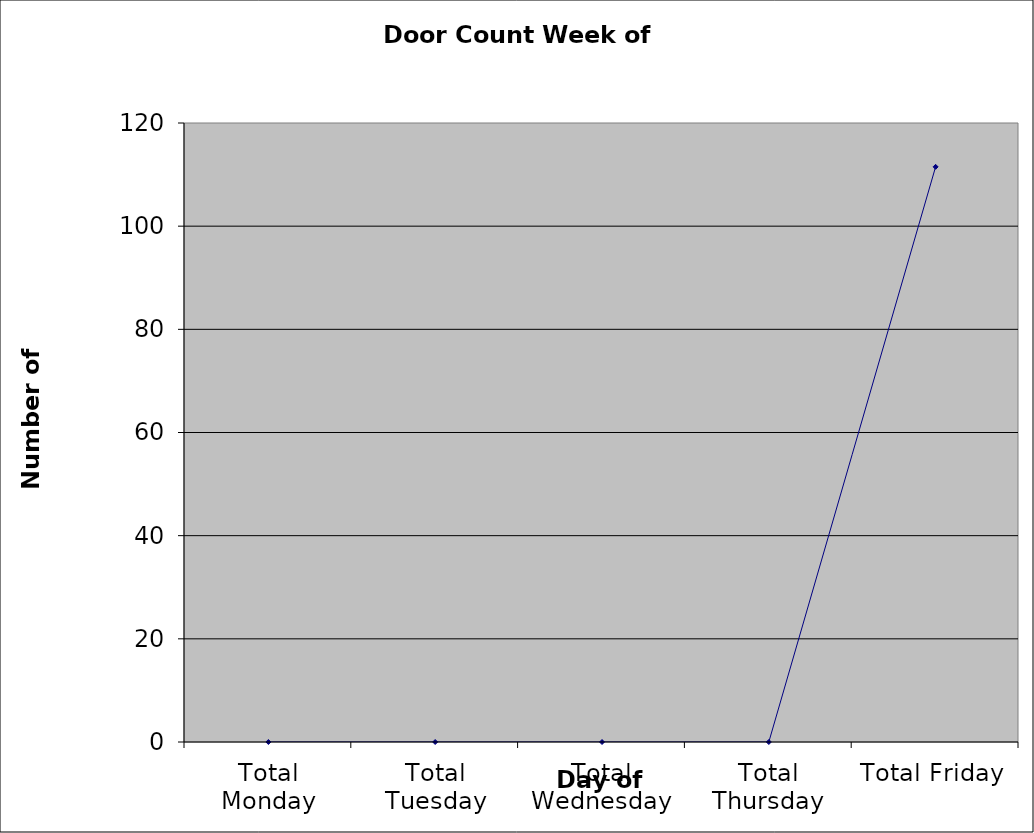
| Category | Series 0 |
|---|---|
| Total Monday | 0 |
| Total Tuesday | 0 |
| Total Wednesday | 0 |
| Total Thursday | 0 |
| Total Friday | 111.5 |